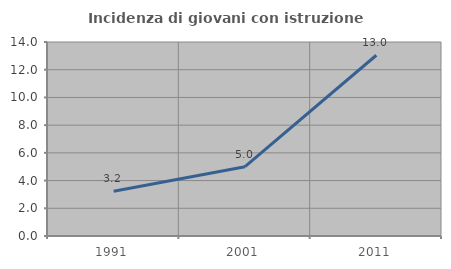
| Category | Incidenza di giovani con istruzione universitaria |
|---|---|
| 1991.0 | 3.226 |
| 2001.0 | 5 |
| 2011.0 | 13.043 |